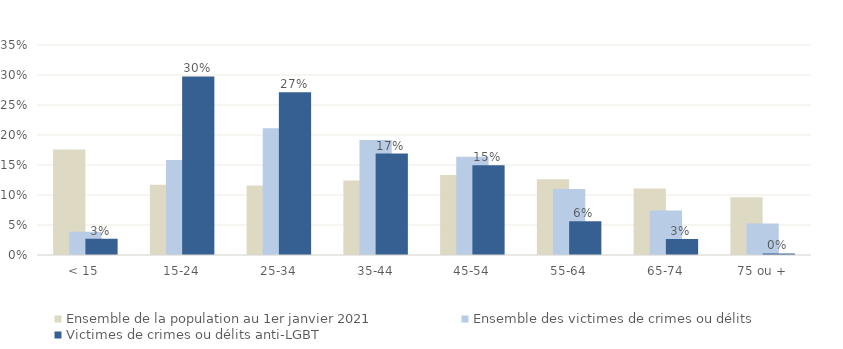
| Category | Ensemble de la population au 1er janvier 2021 | Ensemble des victimes de crimes ou délits | Victimes de crimes ou délits anti-LGBT |
|---|---|---|---|
| < 15 | 0.176 | 0.039 | 0.027 |
| 15-24 | 0.117 | 0.158 | 0.298 |
| 25-34 | 0.116 | 0.211 | 0.271 |
| 35-44 | 0.124 | 0.192 | 0.169 |
| 45-54 | 0.133 | 0.164 | 0.149 |
| 55-64 | 0.126 | 0.11 | 0.056 |
| 65-74 | 0.111 | 0.074 | 0.027 |
| 75 ou + | 0.096 | 0.052 | 0.003 |